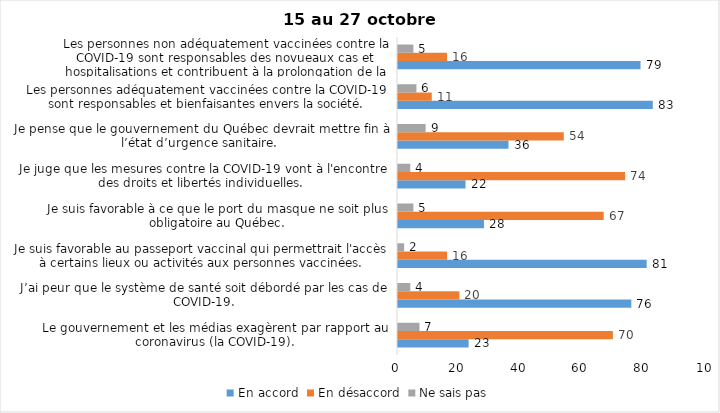
| Category | En accord | En désaccord | Ne sais pas |
|---|---|---|---|
| Le gouvernement et les médias exagèrent par rapport au coronavirus (la COVID-19). | 23 | 70 | 7 |
| J’ai peur que le système de santé soit débordé par les cas de COVID-19. | 76 | 20 | 4 |
| Je suis favorable au passeport vaccinal qui permettrait l'accès à certains lieux ou activités aux personnes vaccinées. | 81 | 16 | 2 |
| Je suis favorable à ce que le port du masque ne soit plus obligatoire au Québec. | 28 | 67 | 5 |
| Je juge que les mesures contre la COVID-19 vont à l'encontre des droits et libertés individuelles.  | 22 | 74 | 4 |
| Je pense que le gouvernement du Québec devrait mettre fin à l’état d’urgence sanitaire.  | 36 | 54 | 9 |
| Les personnes adéquatement vaccinées contre la COVID-19 sont responsables et bienfaisantes envers la société. | 83 | 11 | 6 |
| Les personnes non adéquatement vaccinées contre la COVID-19 sont responsables des novueaux cas et hospitalisations et contribuent à la prolongation de la pandémie au Québec. | 79 | 16 | 5 |